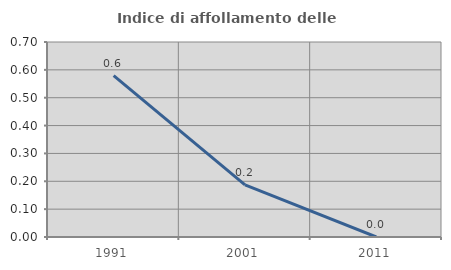
| Category | Indice di affollamento delle abitazioni  |
|---|---|
| 1991.0 | 0.579 |
| 2001.0 | 0.187 |
| 2011.0 | 0 |